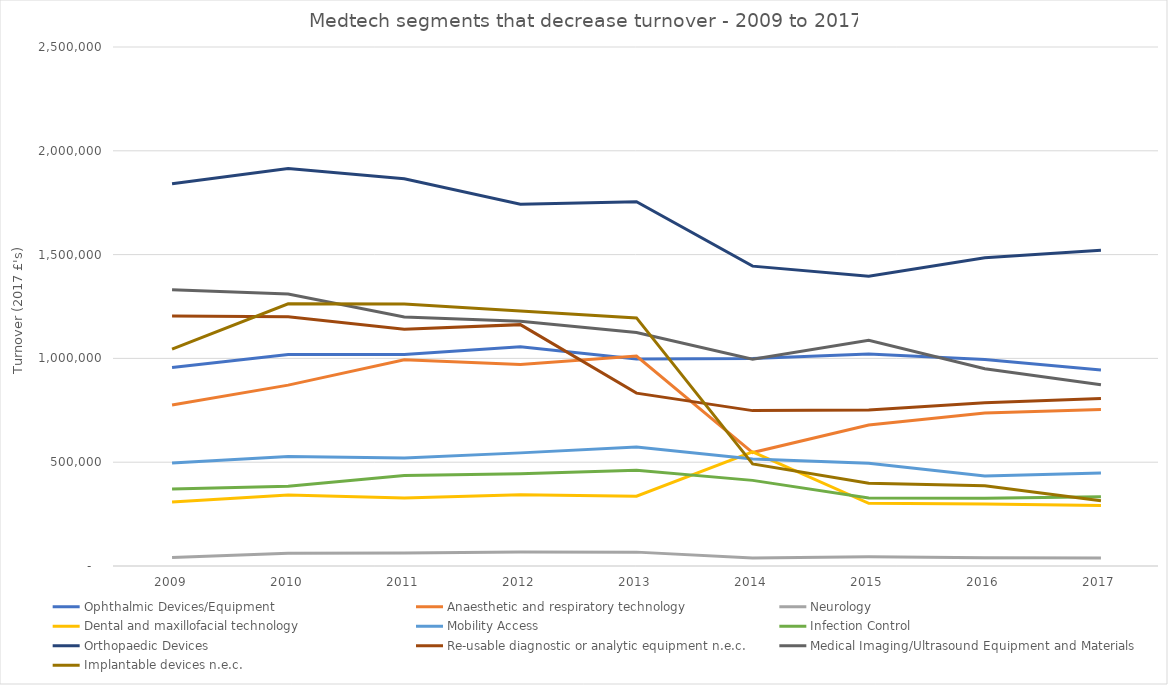
| Category |  Ophthalmic Devices/Equipment  |  Anaesthetic and respiratory technology  |  Neurology  |  Dental and maxillofacial technology  |  Mobility Access  |  Infection Control   |  Orthopaedic Devices  |  Re-usable diagnostic or analytic equipment n.e.c.  |  Medical Imaging/Ultrasound Equipment and Materials  |  Implantable devices n.e.c.  |
|---|---|---|---|---|---|---|---|---|---|---|
|  2009  | 956462 | 775263 | 40460 | 308281 | 496218 | 371109 | 1840837 | 1204244 | 1331134 | 1044640 |
|  2010  | 1019074 | 871190 | 61728 | 342070 | 527082 | 384304 | 1915087 | 1201109 | 1310560 | 1262777 |
|  2011  | 1018445 | 993360 | 62207 | 327483 | 519783 | 435851 | 1865372 | 1140475 | 1199487 | 1262365 |
|  2012  | 1055566 | 970534 | 67720 | 343622 | 544916 | 443795 | 1743104 | 1162641 | 1178623 | 1228381 |
|  2013  | 997392 | 1011128 | 66834 | 336565 | 573657 | 460921 | 1754847 | 832544 | 1124560 | 1195157 |
|  2014  | 998930 | 546510 | 38385 | 550118 | 515758 | 412469 | 1444488 | 748492 | 995710 | 491830 |
|  2015  | 1020621 | 678980 | 44277 | 301840 | 494525 | 328133 | 1395611 | 751497 | 1087299 | 398759 |
|  2016  | 994884 | 736790 | 39992 | 298107 | 434044 | 326381 | 1485136 | 786366 | 949941 | 386265 |
|  2017  | 944083 | 754095 | 38289 | 291630 | 447770 | 333854 | 1520402 | 807160 | 873442 | 314782 |